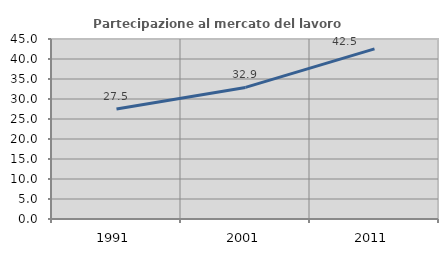
| Category | Partecipazione al mercato del lavoro  femminile |
|---|---|
| 1991.0 | 27.5 |
| 2001.0 | 32.899 |
| 2011.0 | 42.521 |